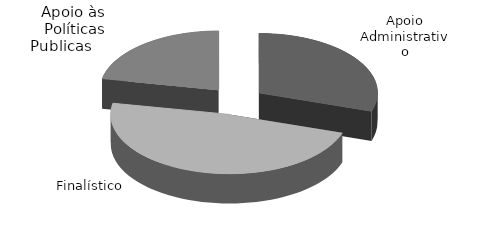
| Category | Series 0 | Series 1 | Series 2 |
|---|---|---|---|
| 0 | 117797073.84 |  |  |
| 1 | 188441053.91 |  |  |
| 2 | 86306927.63 |  |  |